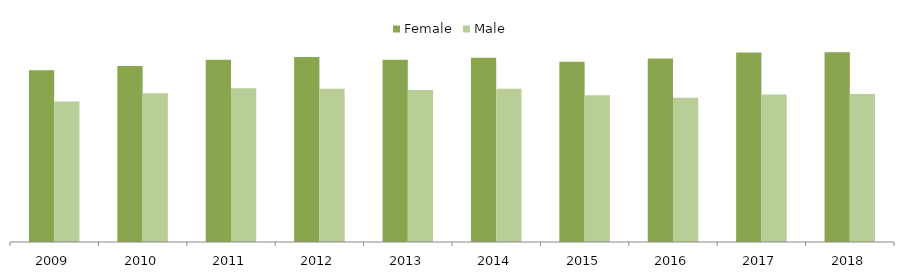
| Category | Female | Male |
|---|---|---|
| 2009 | 5102 | 4172 |
| 2010 | 5229 | 4421 |
| 2011 | 5411 | 4570 |
| 2012 | 5493 | 4552 |
| 2013 | 5417 | 4513 |
| 2014 | 5471 | 4552 |
| 2015 | 5352 | 4361 |
| 2016 | 5449 | 4286 |
| 2017 | 5626 | 4380 |
| 2018 | 5637 | 4398 |